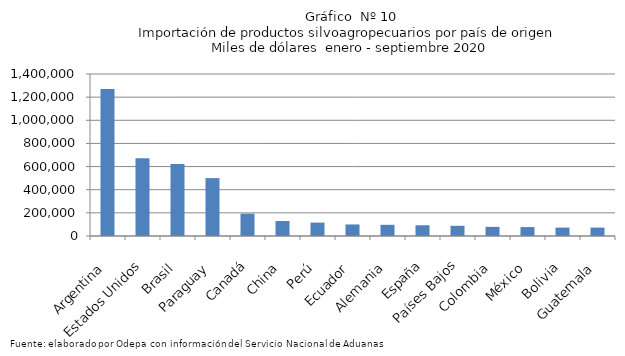
| Category | Series 0 |
|---|---|
| Argentina | 1270885.377 |
| Estados Unidos | 671684.814 |
| Brasil | 622684.012 |
| Paraguay | 500106.035 |
| Canadá | 192980.393 |
| China | 129327.695 |
| Perú | 115689.09 |
| Ecuador | 99800.106 |
| Alemania | 96698.1 |
| España | 92814.672 |
| Países Bajos | 88105.694 |
| Colombia | 78824.024 |
| México | 77085.739 |
| Bolivia | 72632.933 |
| Guatemala | 72620.603 |